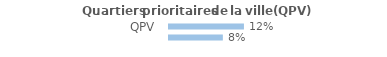
| Category | Series 0 |
|---|---|
| QPV | 0.116 |
| Hors QPV | 0.084 |